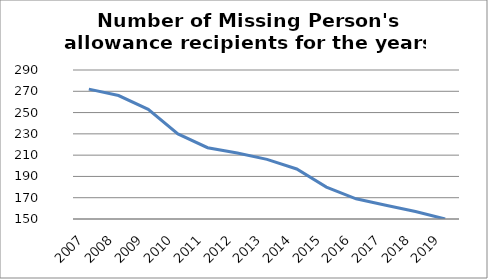
| Category | Series 0 |
|---|---|
| 2007.0 | 272 |
| 2008.0 | 266 |
| 2009.0 | 253 |
| 2010.0 | 230 |
| 2011.0 | 217 |
| 2012.0 | 212 |
| 2013.0 | 206 |
| 2014.0 | 197 |
| 2015.0 | 180 |
| 2016.0 | 169 |
| 2017.0 | 163 |
| 2018.0 | 157 |
| 2019.0 | 150 |